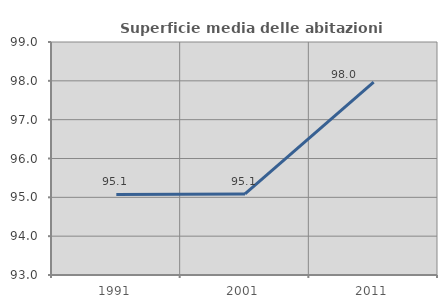
| Category | Superficie media delle abitazioni occupate |
|---|---|
| 1991.0 | 95.076 |
| 2001.0 | 95.087 |
| 2011.0 | 97.964 |